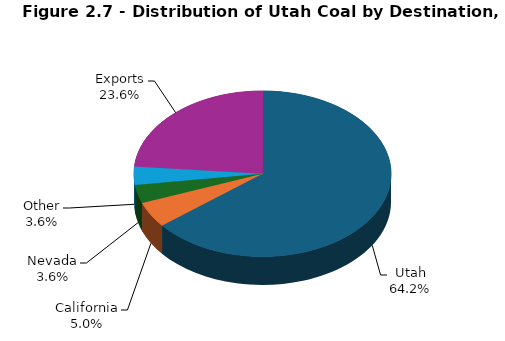
| Category | Series 0 |
|---|---|
| Utah | 7630.927 |
| California | 595.079 |
| Nevada | 423.264 |
| Other | 427.267 |
| Exports | 2802.5 |